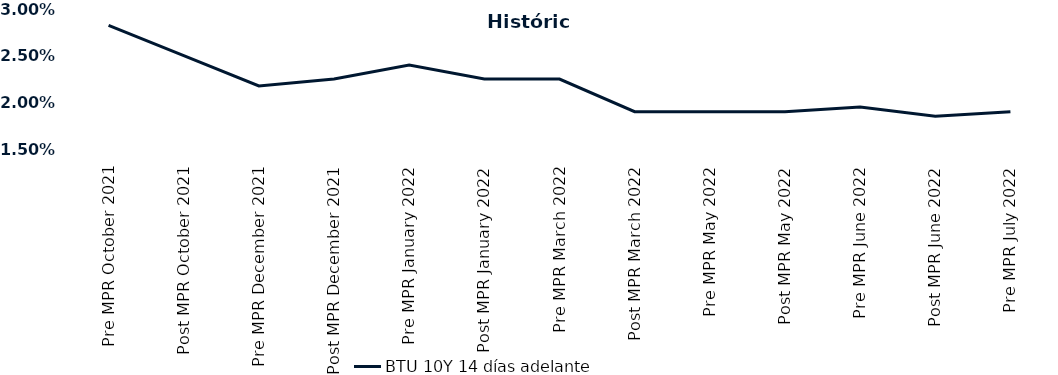
| Category | BTU 10Y 14 días adelante |
|---|---|
| Pre MPR October 2021 | 0.028 |
| Post MPR October 2021 | 0.025 |
| Pre MPR December 2021 | 0.022 |
| Post MPR December 2021 | 0.022 |
| Pre MPR January 2022 | 0.024 |
| Post MPR January 2022 | 0.022 |
| Pre MPR March 2022 | 0.022 |
| Post MPR March 2022 | 0.019 |
| Pre MPR May 2022 | 0.019 |
| Post MPR May 2022 | 0.019 |
| Pre MPR June 2022 | 0.02 |
| Post MPR June 2022 | 0.018 |
| Pre MPR July 2022 | 0.019 |